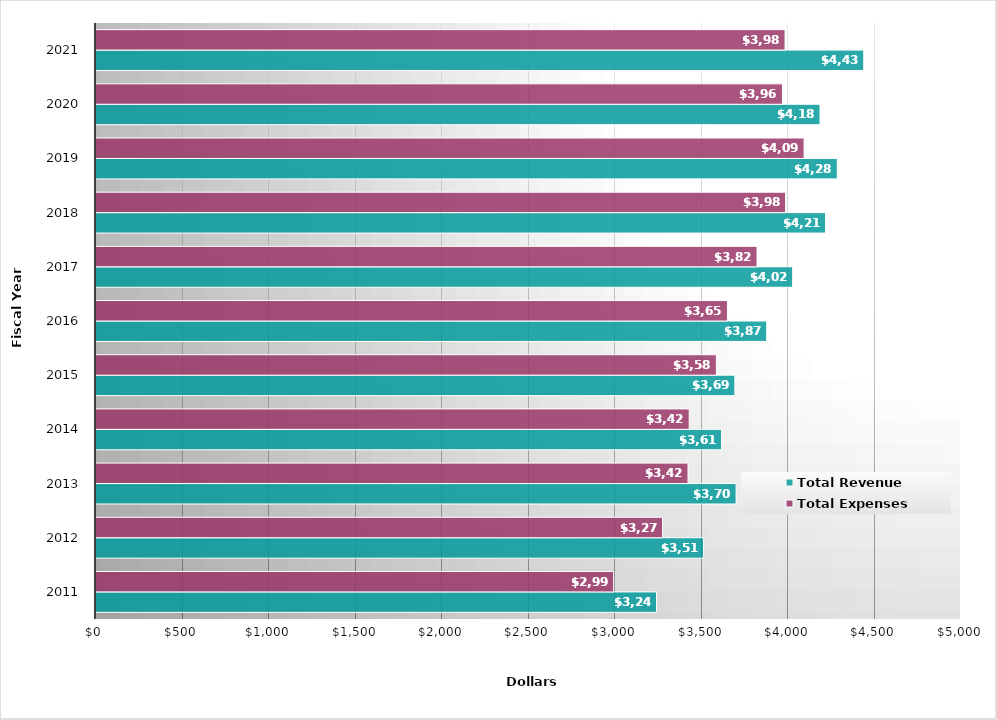
| Category | Total Revenue | Total Expenses |
|---|---|---|
| 2011.0 | 3240 | 2992 |
| 2012.0 | 3512 | 3275 |
| 2013.0 | 3700 | 3422 |
| 2014.0 | 3616 | 3429 |
| 2015.0 | 3693 | 3586 |
| 2016.0 | 3877 | 3650 |
| 2017.0 | 4027 | 3821 |
| 2018.0 | 4217 | 3986 |
| 2019.0 | 4285 | 4093 |
| 2020.0 | 4185 | 3968 |
| 2021.0 | 4438 | 3983 |